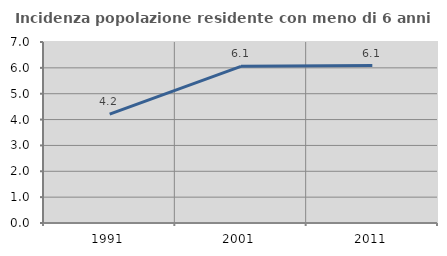
| Category | Incidenza popolazione residente con meno di 6 anni |
|---|---|
| 1991.0 | 4.208 |
| 2001.0 | 6.059 |
| 2011.0 | 6.086 |